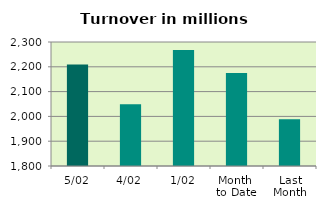
| Category | Series 0 |
|---|---|
| 5/02 | 2209.356 |
| 4/02 | 2049.201 |
| 1/02 | 2267.407 |
| Month 
to Date | 2175.322 |
| Last
Month | 1988.014 |